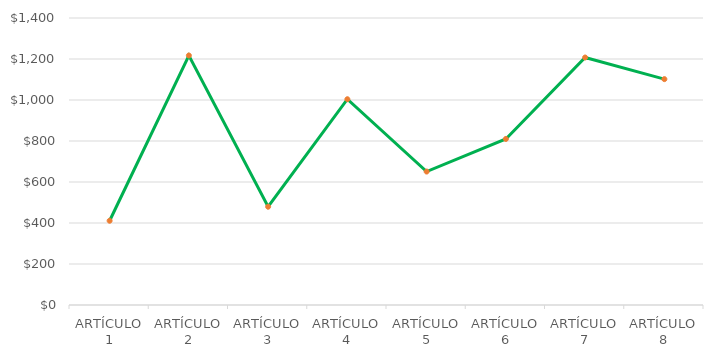
| Category | Series 1 |
|---|---|
| ARTÍCULO 1 | 411.07 |
| ARTÍCULO 2 | 1217.065 |
| ARTÍCULO 3 | 479.5 |
| ARTÍCULO 4 | 1003.75 |
| ARTÍCULO 5 | 651 |
| ARTÍCULO 6 | 810 |
| ARTÍCULO 7 | 1207.25 |
| ARTÍCULO 8 | 1101.76 |